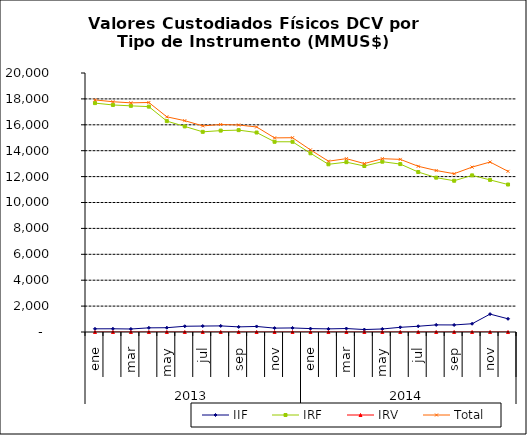
| Category | IIF | IRF | IRV | Total |
|---|---|---|---|---|
| 0 | 246.058 | 17675.595 | 0 | 17921.653 |
| 1900-01-01 | 248.565 | 17532.262 | 0 | 17780.827 |
| 1900-01-02 | 232.11 | 17463.557 | 0 | 17695.667 |
| 1900-01-03 | 320.19 | 17402.88 | 0 | 17723.071 |
| 1900-01-04 | 331.514 | 16284.137 | 0 | 16615.651 |
| 1900-01-05 | 443.085 | 15875.554 | 0 | 16318.639 |
| 1900-01-06 | 459.473 | 15456.318 | 0 | 15915.791 |
| 1900-01-07 | 470.581 | 15551.62 | 0 | 16022.201 |
| 1900-01-08 | 395.425 | 15589.918 | 0 | 15985.343 |
| 1900-01-09 | 429.465 | 15403.335 | 0 | 15832.799 |
| 1900-01-10 | 300.401 | 14688.927 | 0 | 14989.327 |
| 1900-01-11 | 313.525 | 14689.453 | 0 | 15002.978 |
| 1900-01-12 | 262.522 | 13801.442 | 0 | 14063.964 |
| 1900-01-13 | 240.521 | 12950.356 | 0 | 13190.877 |
| 1900-01-14 | 268.964 | 13115.671 | 0 | 13384.635 |
| 1900-01-15 | 189.002 | 12817.695 | 0 | 13006.697 |
| 1900-01-16 | 233.226 | 13150.445 | 0 | 13383.671 |
| 1900-01-17 | 362.428 | 12967.474 | 0 | 13329.902 |
| 1900-01-18 | 444.215 | 12353.018 | 0 | 12797.233 |
| 1900-01-19 | 549.81 | 11919.356 | 0 | 12469.167 |
| 1900-01-20 | 544.517 | 11679.684 | 0 | 12224.2 |
| 1900-01-21 | 637.749 | 12095.534 | 0 | 12733.283 |
| 1900-01-22 | 1381.042 | 11744.065 | 0 | 13125.107 |
| 1900-01-23 | 1019.147 | 11387.8 | 0 | 12406.948 |